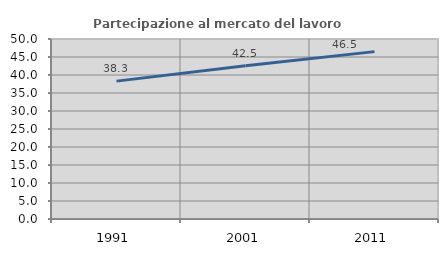
| Category | Partecipazione al mercato del lavoro  femminile |
|---|---|
| 1991.0 | 38.298 |
| 2001.0 | 42.541 |
| 2011.0 | 46.491 |